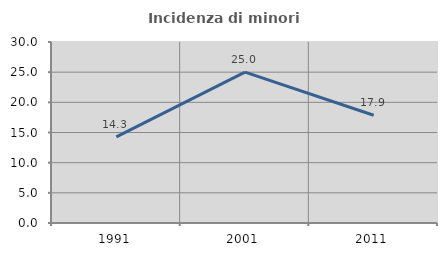
| Category | Incidenza di minori stranieri |
|---|---|
| 1991.0 | 14.286 |
| 2001.0 | 25 |
| 2011.0 | 17.857 |